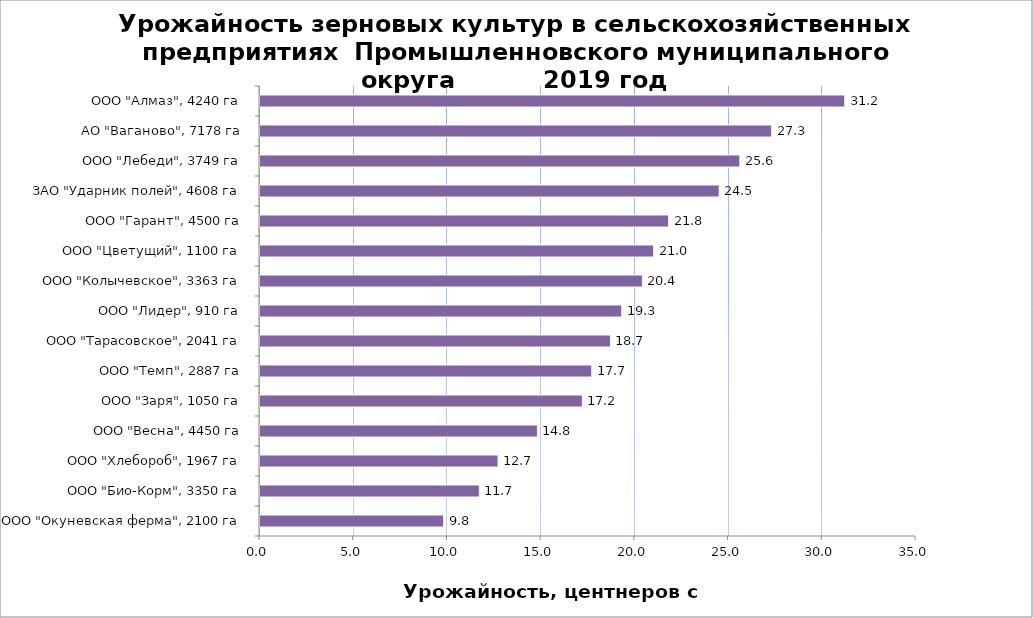
| Category | Series 0 |
|---|---|
| ООО "Окуневская ферма", 2100 га | 9.8 |
| ООО "Био-Корм", 3350 га | 11.7 |
| ООО "Хлебороб", 1967 га | 12.7 |
| ООО "Весна", 4450 га | 14.8 |
| ООО "Заря", 1050 га | 17.2 |
| ООО "Темп", 2887 га | 17.7 |
| ООО "Тарасовское", 2041 га | 18.7 |
| ООО "Лидер", 910 га | 19.3 |
| ООО "Колычевское", 3363 га | 20.4 |
| ООО "Цветущий", 1100 га | 21 |
| ООО "Гарант", 4500 га | 21.8 |
| ЗАО "Ударник полей", 4608 га | 24.5 |
| ООО "Лебеди", 3749 га | 25.6 |
| АО "Ваганово", 7178 га | 27.3 |
| ООО "Алмаз", 4240 га | 31.2 |